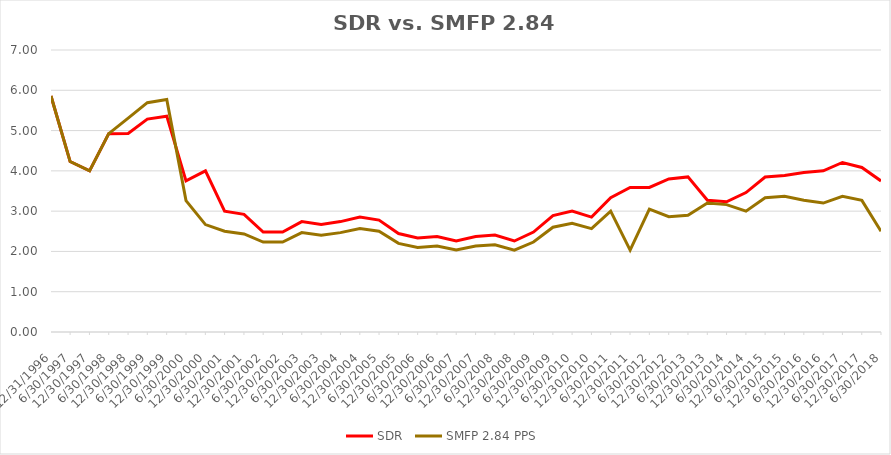
| Category | SDR | SMFP 2.84 PPS |
|---|---|---|
| 12/31/96 | 5.857 | 5.857 |
| 6/30/97 | 4.231 | 4.231 |
| 12/31/97 | 4 | 4 |
| 6/30/98 | 4.923 | 4.923 |
| 12/31/98 | 4.929 | 5.308 |
| 6/30/99 | 5.286 | 5.692 |
| 12/31/99 | 5.357 | 5.769 |
| 6/30/00 | 3.75 | 3.261 |
| 12/31/00 | 4 | 2.667 |
| 6/30/01 | 3 | 2.5 |
| 12/31/01 | 2.92 | 2.433 |
| 6/30/02 | 2.481 | 2.233 |
| 12/31/02 | 2.481 | 2.233 |
| 6/30/03 | 2.741 | 2.467 |
| 12/31/03 | 2.667 | 2.4 |
| 6/30/04 | 2.741 | 2.467 |
| 12/31/04 | 2.852 | 2.567 |
| 6/30/05 | 2.778 | 2.5 |
| 12/31/05 | 2.444 | 2.2 |
| 6/30/06 | 2.333 | 2.1 |
| 12/31/06 | 2.37 | 2.133 |
| 6/30/07 | 2.259 | 2.033 |
| 12/31/07 | 2.37 | 2.133 |
| 6/30/08 | 2.407 | 2.167 |
| 12/31/08 | 2.259 | 2.033 |
| 6/30/09 | 2.481 | 2.233 |
| 12/31/09 | 2.889 | 2.6 |
| 6/30/10 | 3 | 2.7 |
| 12/31/10 | 2.852 | 2.567 |
| 6/30/11 | 3.333 | 3 |
| 12/31/11 | 3.588 | 2.033 |
| 6/30/12 | 3.588 | 3.05 |
| 12/31/12 | 3.8 | 2.861 |
| 6/30/13 | 3.85 | 2.898 |
| 12/31/13 | 3.269 | 3.2 |
| 6/30/14 | 3.231 | 3.162 |
| 12/31/14 | 3.462 | 3 |
| 6/30/15 | 3.846 | 3.333 |
| 12/31/15 | 3.885 | 3.367 |
| 6/30/16 | 3.958 | 3.271 |
| 12/31/16 | 4 | 3.2 |
| 6/30/17 | 4.208 | 3.367 |
| 12/31/17 | 4.083 | 3.267 |
| 6/30/18 | 3.75 | 2.5 |